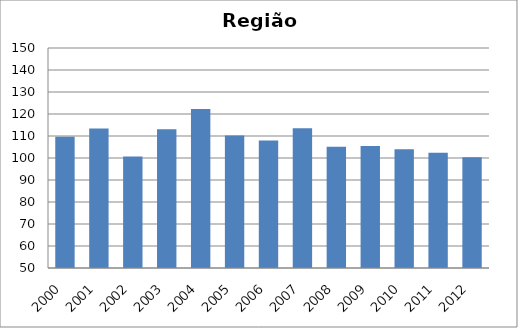
| Category | Tríplice viral/sarampo |
|---|---|
| 2000.0 | 109.61 |
| 2001.0 | 113.45 |
| 2002.0 | 100.72 |
| 2003.0 | 113.08 |
| 2004.0 | 122.27 |
| 2005.0 | 110.21 |
| 2006.0 | 107.95 |
| 2007.0 | 113.47 |
| 2008.0 | 105.13 |
| 2009.0 | 105.42 |
| 2010.0 | 104.02 |
| 2011.0 | 102.4 |
| 2012.0 | 100.32 |